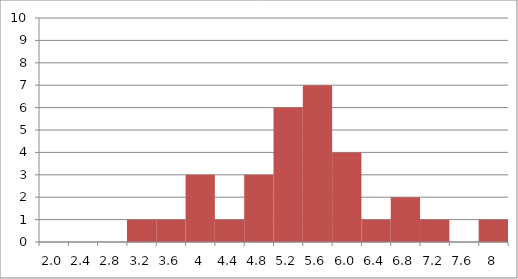
| Category | Series 1 |
|---|---|
| 2.0 | 0 |
| 2.4 | 0 |
| 2.8 | 0 |
| 3.2 | 1 |
| 3.6 | 1 |
| 4.0 | 3 |
| 4.4 | 1 |
| 4.8 | 3 |
| 5.2 | 6 |
| 5.6 | 7 |
| 6.0 | 4 |
| 6.4 | 1 |
| 6.8 | 2 |
| 7.2 | 1 |
| 7.6 | 0 |
| 8.0 | 1 |